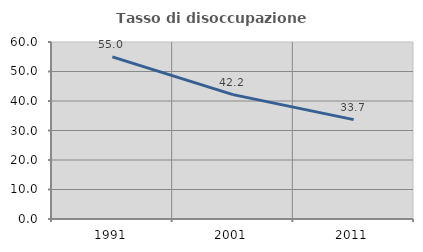
| Category | Tasso di disoccupazione giovanile  |
|---|---|
| 1991.0 | 54.969 |
| 2001.0 | 42.151 |
| 2011.0 | 33.684 |